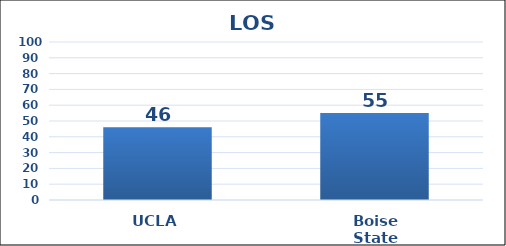
| Category | Series 0 |
|---|---|
| UCLA | 46 |
| Boise State | 55 |